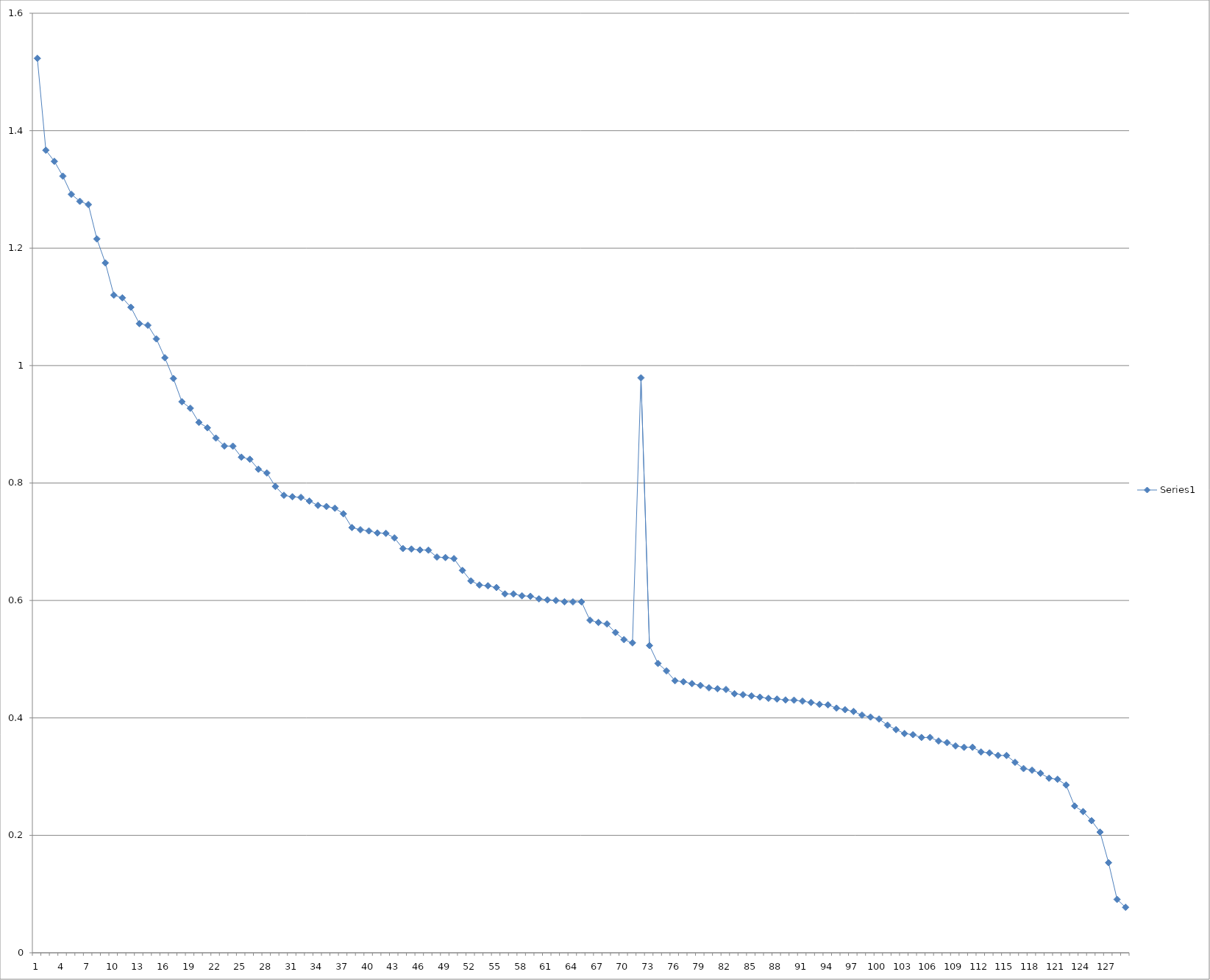
| Category | Series 0 |
|---|---|
| 0 | 1.523 |
| 1 | 1.367 |
| 2 | 1.348 |
| 3 | 1.323 |
| 4 | 1.292 |
| 5 | 1.28 |
| 6 | 1.274 |
| 7 | 1.216 |
| 8 | 1.175 |
| 9 | 1.12 |
| 10 | 1.115 |
| 11 | 1.099 |
| 12 | 1.071 |
| 13 | 1.069 |
| 14 | 1.045 |
| 15 | 1.013 |
| 16 | 0.978 |
| 17 | 0.938 |
| 18 | 0.927 |
| 19 | 0.903 |
| 20 | 0.894 |
| 21 | 0.877 |
| 22 | 0.863 |
| 23 | 0.863 |
| 24 | 0.844 |
| 25 | 0.84 |
| 26 | 0.824 |
| 27 | 0.817 |
| 28 | 0.794 |
| 29 | 0.779 |
| 30 | 0.777 |
| 31 | 0.776 |
| 32 | 0.769 |
| 33 | 0.762 |
| 34 | 0.76 |
| 35 | 0.757 |
| 36 | 0.748 |
| 37 | 0.724 |
| 38 | 0.72 |
| 39 | 0.718 |
| 40 | 0.715 |
| 41 | 0.714 |
| 42 | 0.707 |
| 43 | 0.688 |
| 44 | 0.688 |
| 45 | 0.686 |
| 46 | 0.686 |
| 47 | 0.674 |
| 48 | 0.673 |
| 49 | 0.671 |
| 50 | 0.651 |
| 51 | 0.633 |
| 52 | 0.626 |
| 53 | 0.625 |
| 54 | 0.622 |
| 55 | 0.611 |
| 56 | 0.611 |
| 57 | 0.608 |
| 58 | 0.607 |
| 59 | 0.603 |
| 60 | 0.601 |
| 61 | 0.6 |
| 62 | 0.598 |
| 63 | 0.598 |
| 64 | 0.598 |
| 65 | 0.566 |
| 66 | 0.562 |
| 67 | 0.56 |
| 68 | 0.545 |
| 69 | 0.533 |
| 70 | 0.528 |
| 71 | 0.979 |
| 72 | 0.523 |
| 73 | 0.493 |
| 74 | 0.48 |
| 75 | 0.463 |
| 76 | 0.462 |
| 77 | 0.458 |
| 78 | 0.455 |
| 79 | 0.451 |
| 80 | 0.45 |
| 81 | 0.448 |
| 82 | 0.441 |
| 83 | 0.44 |
| 84 | 0.437 |
| 85 | 0.435 |
| 86 | 0.433 |
| 87 | 0.432 |
| 88 | 0.431 |
| 89 | 0.43 |
| 90 | 0.429 |
| 91 | 0.426 |
| 92 | 0.423 |
| 93 | 0.422 |
| 94 | 0.417 |
| 95 | 0.414 |
| 96 | 0.411 |
| 97 | 0.405 |
| 98 | 0.401 |
| 99 | 0.398 |
| 100 | 0.388 |
| 101 | 0.38 |
| 102 | 0.373 |
| 103 | 0.371 |
| 104 | 0.367 |
| 105 | 0.367 |
| 106 | 0.361 |
| 107 | 0.358 |
| 108 | 0.352 |
| 109 | 0.35 |
| 110 | 0.35 |
| 111 | 0.342 |
| 112 | 0.34 |
| 113 | 0.336 |
| 114 | 0.336 |
| 115 | 0.324 |
| 116 | 0.314 |
| 117 | 0.311 |
| 118 | 0.306 |
| 119 | 0.297 |
| 120 | 0.295 |
| 121 | 0.286 |
| 122 | 0.25 |
| 123 | 0.24 |
| 124 | 0.225 |
| 125 | 0.205 |
| 126 | 0.153 |
| 127 | 0.091 |
| 128 | 0.077 |